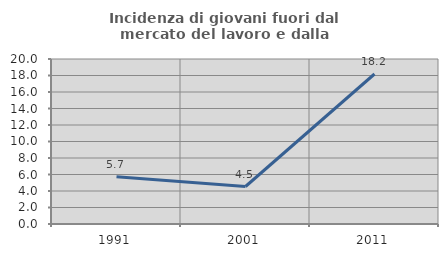
| Category | Incidenza di giovani fuori dal mercato del lavoro e dalla formazione  |
|---|---|
| 1991.0 | 5.714 |
| 2001.0 | 4.545 |
| 2011.0 | 18.182 |